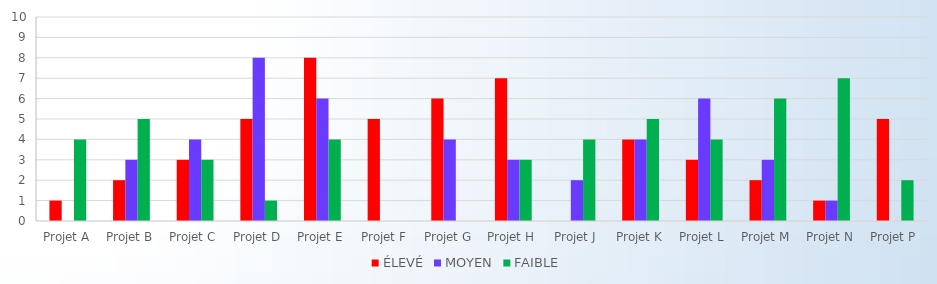
| Category | ÉLEVÉ | MOYEN | FAIBLE |
|---|---|---|---|
| Projet A | 1 | 0 | 4 |
| Projet B | 2 | 3 | 5 |
| Projet C | 3 | 4 | 3 |
| Projet D | 5 | 8 | 1 |
| Projet E | 8 | 6 | 4 |
| Projet F | 5 | 0 | 0 |
| Projet G | 6 | 4 | 0 |
| Projet H | 7 | 3 | 3 |
| Projet J | 0 | 2 | 4 |
| Projet K | 4 | 4 | 5 |
| Projet L | 3 | 6 | 4 |
| Projet M | 2 | 3 | 6 |
| Projet N | 1 | 1 | 7 |
| Projet P | 5 | 0 | 2 |